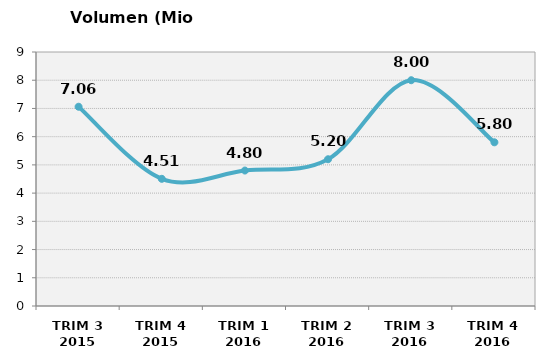
| Category | Volumen (Mio consumiciones) |
|---|---|
| TRIM 3 2015 | 7.06 |
| TRIM 4 2015 | 4.506 |
| TRIM 1 2016 | 4.8 |
| TRIM 2 2016 | 5.2 |
| TRIM 3 2016 | 8 |
| TRIM 4 2016 | 5.8 |